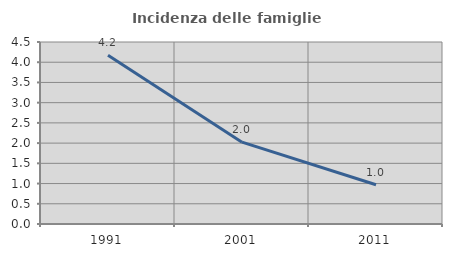
| Category | Incidenza delle famiglie numerose |
|---|---|
| 1991.0 | 4.172 |
| 2001.0 | 2.024 |
| 2011.0 | 0.971 |